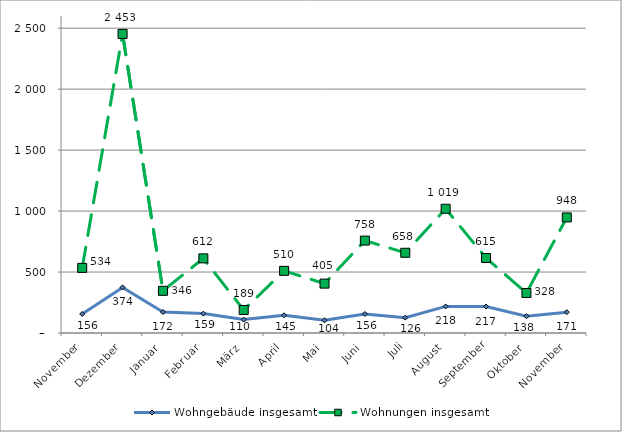
| Category | Wohngebäude insgesamt | Wohnungen insgesamt |
|---|---|---|
| November | 156 | 534 |
| Dezember | 374 | 2453 |
| Januar | 172 | 346 |
| Februar | 159 | 612 |
| März | 110 | 189 |
| April | 145 | 510 |
| Mai | 104 | 405 |
| Juni | 156 | 758 |
| Juli | 126 | 658 |
| August | 218 | 1019 |
| September | 217 | 615 |
| Oktober | 138 | 328 |
| November | 171 | 948 |